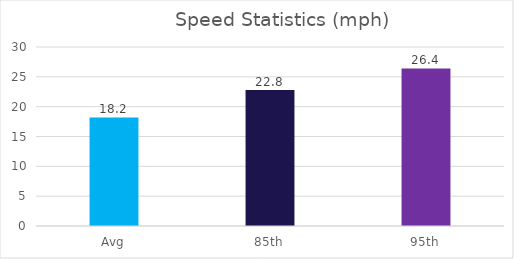
| Category | Series 0 |
|---|---|
| Avg | 18.2 |
| 85th | 22.8 |
| 95th | 26.4 |